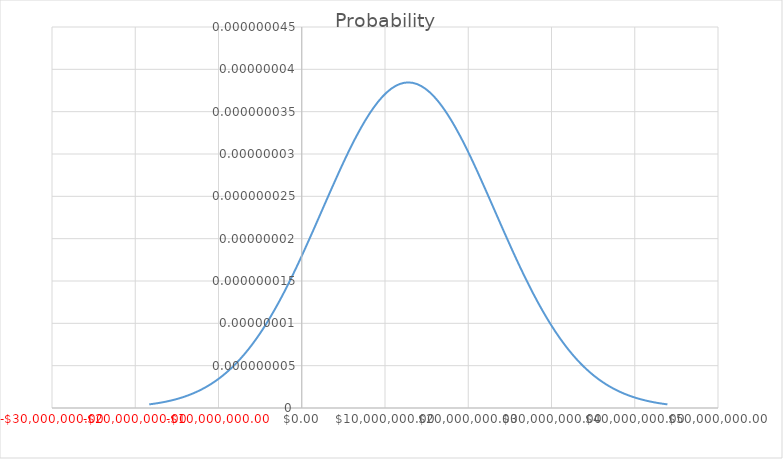
| Category | Probability  |
|---|---|
| 43922755.70385513 | 0 |
| 42885326.07705996 | 0 |
| 41847896.45026479 | 0 |
| 40810466.82346962 | 0 |
| 39773037.19667445 | 0 |
| 38735607.56987928 | 0 |
| 37698177.943084106 | 0 |
| 36660748.31628893 | 0 |
| 35623318.68949377 | 0 |
| 34585889.062698595 | 0 |
| 33548459.435903423 | 0 |
| 32511029.80910825 | 0 |
| 31473600.182313077 | 0 |
| 30436170.555517904 | 0 |
| 29398740.92872274 | 0 |
| 28361311.301927567 | 0 |
| 27323881.675132394 | 0 |
| 26286452.048337225 | 0 |
| 25249022.421542052 | 0 |
| 24211592.794746883 | 0 |
| 23174163.16795171 | 0 |
| 22136733.541156538 | 0 |
| 21099303.91436137 | 0 |
| 20061874.287566196 | 0 |
| 19024444.660771027 | 0 |
| 17987015.033975855 | 0 |
| 16949585.407180686 | 0 |
| 15912155.780385513 | 0 |
| 14874726.153590342 | 0 |
| 13837296.526795171 | 0 |
| 12799866.9 | 0 |
| 11762437.27320483 | 0 |
| 10725007.646409659 | 0 |
| 9687578.019614488 | 0 |
| 8650148.392819315 | 0 |
| 7612718.766024145 | 0 |
| 6575289.1392289745 | 0 |
| 5537859.512433804 | 0 |
| 4500429.885638632 | 0 |
| 3463000.258843461 | 0 |
| 2425570.63204829 | 0 |
| 1388141.0052531175 | 0 |
| 350711.37845794857 | 0 |
| -686718.2483372241 | 0 |
| -1724147.875132393 | 0 |
| -2761577.501927564 | 0 |
| -3799007.1287227366 | 0 |
| -4836436.755517906 | 0 |
| -5873866.382313078 | 0 |
| -6911296.009108247 | 0 |
| -7948725.63590342 | 0 |
| -8986155.262698593 | 0 |
| -10023584.889493765 | 0 |
| -11061014.51628893 | 0 |
| -12098444.143084103 | 0 |
| -13135873.76987938 | 0 |
| -14173303.396674449 | 0 |
| -15210733.023469618 | 0 |
| -16248162.65026489 | 0 |
| -17285592.27706006 | 0 |
| -18323021.903855234 | 0 |